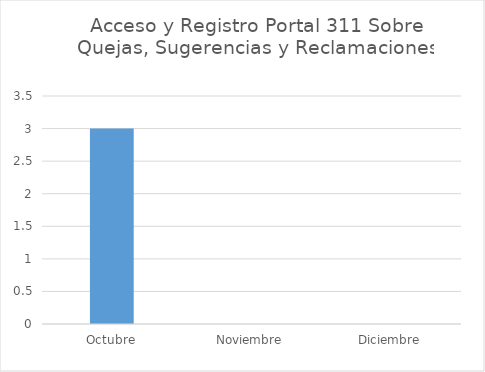
| Category | Series 0 |
|---|---|
| Octubre | 3 |
| Noviembre | 0 |
| Diciembre | 0 |